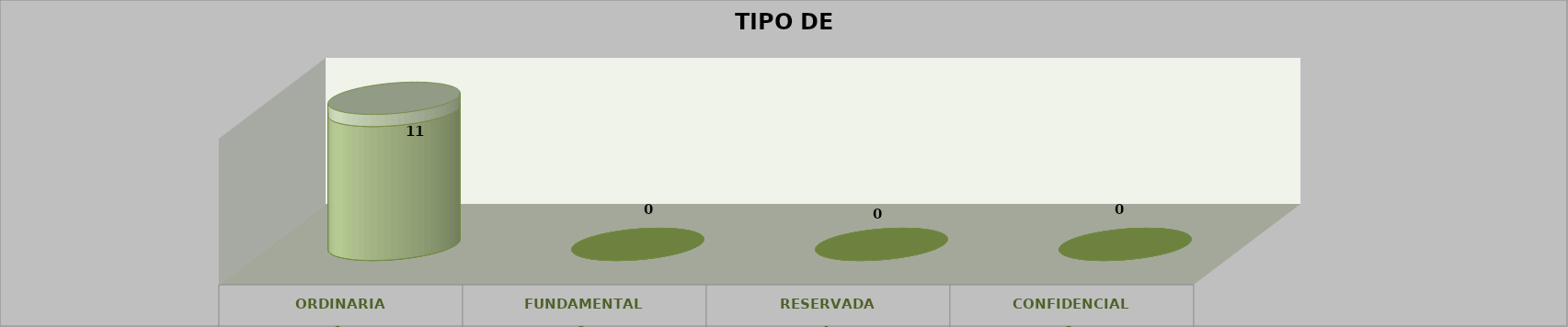
| Category | Series 0 | Series 2 | Series 1 | Series 3 | Series 4 |
|---|---|---|---|---|---|
| 0 |  |  |  | 11 | 1 |
| 1 |  |  |  | 0 | 0 |
| 2 |  |  |  | 0 | 0 |
| 3 |  |  |  | 0 | 0 |